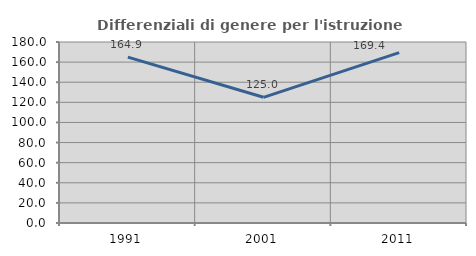
| Category | Differenziali di genere per l'istruzione superiore |
|---|---|
| 1991.0 | 164.926 |
| 2001.0 | 125 |
| 2011.0 | 169.384 |